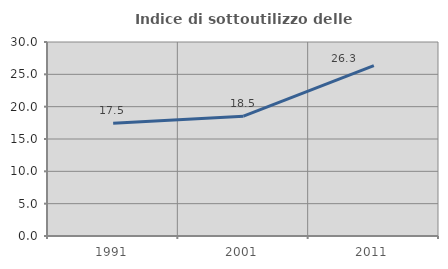
| Category | Indice di sottoutilizzo delle abitazioni  |
|---|---|
| 1991.0 | 17.451 |
| 2001.0 | 18.525 |
| 2011.0 | 26.346 |